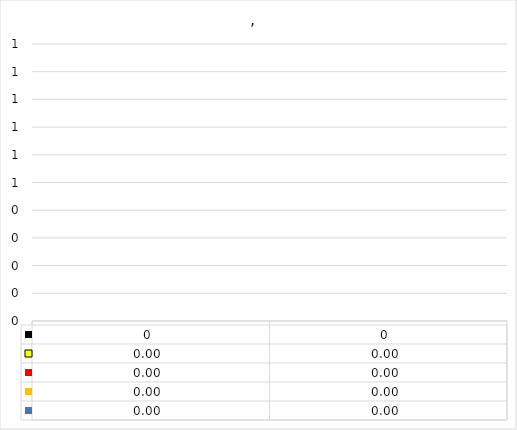
| Category | Series 0 | Series 1 | Series 2 | Series 3 | Series 4 |
|---|---|---|---|---|---|
| 0 | 0 | 0 | 0 | 0 | 0 |
| 1 | 0 | 0 | 0 | 0 | 0 |